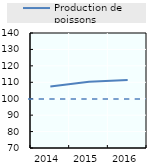
| Category | Production de poissons |
|---|---|
| 2014.0 | 107.472 |
| 2015.0 | 110.346 |
| 2016.0 | 111.402 |